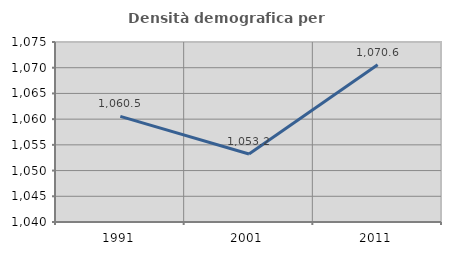
| Category | Densità demografica |
|---|---|
| 1991.0 | 1060.539 |
| 2001.0 | 1053.216 |
| 2011.0 | 1070.579 |